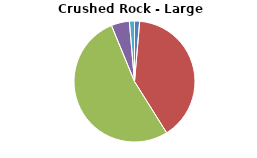
| Category | Series 0 |
|---|---|
| DRILLING AND BLASTING | 1.231 |
| MATERIAL PROCESSING | 35.777 |
| INTERNAL TRANSPORT | 47.465 |
| MATERIAL HANDLING OPERATION | 4.364 |
| WIND EROSION FROM STOCKPILES | 1.229 |